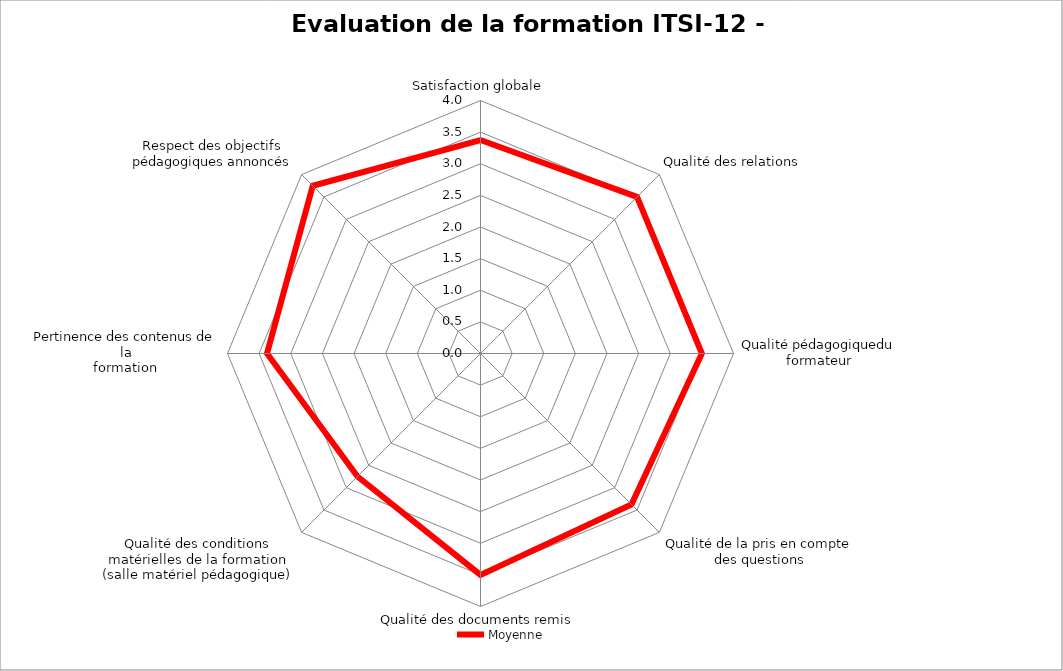
| Category | Moyenne |
|---|---|
| Satisfaction globale | 3.375 |
| Qualité des relations | 3.5 |
| Qualité pédagogiquedu formateur | 3.5 |
| Qualité de la pris en compte des questions | 3.375 |
| Qualité des documents remis | 3.5 |
| Qualité des conditions matérielles de la formation (salle matériel pédagogique) | 2.75 |
| Pertinence des contenus de la
formation | 3.375 |
| Respect des objectifs pédagogiques annoncés | 3.75 |